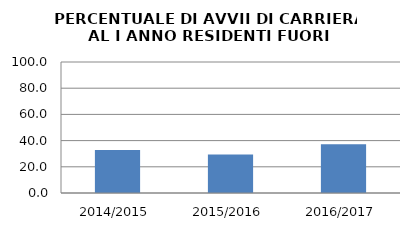
| Category | 2014/2015 2015/2016 2016/2017 |
|---|---|
| 2014/2015 | 32.886 |
| 2015/2016 | 29.333 |
| 2016/2017 | 37.267 |